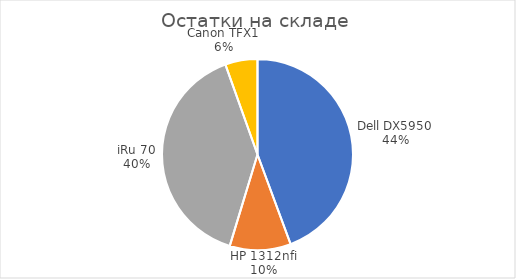
| Category | Текущая сумма |
|---|---|
| Dell DX5950 | 61000 |
| HP 1312nfi | 14200 |
| iRu 70 | 54800 |
| Canon TFX1 | 7500 |